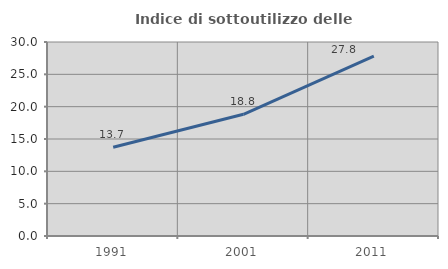
| Category | Indice di sottoutilizzo delle abitazioni  |
|---|---|
| 1991.0 | 13.714 |
| 2001.0 | 18.818 |
| 2011.0 | 27.811 |